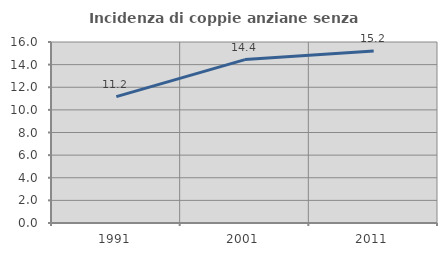
| Category | Incidenza di coppie anziane senza figli  |
|---|---|
| 1991.0 | 11.17 |
| 2001.0 | 14.444 |
| 2011.0 | 15.209 |